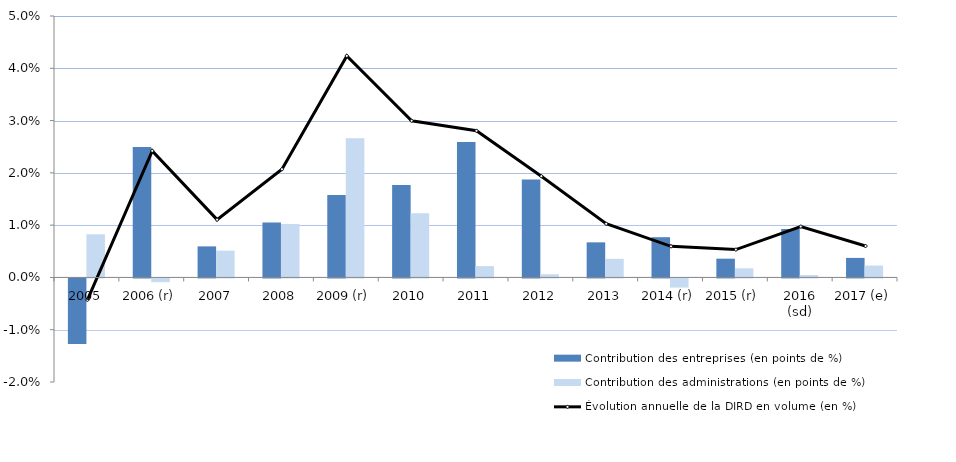
| Category | Contribution des entreprises (en points de %) | Contribution des administrations (en points de %) |
|---|---|---|
| 2005 | -0.013 | 0.008 |
| 2006 (r) | 0.025 | -0.001 |
| 2007 | 0.006 | 0.005 |
| 2008 | 0.011 | 0.01 |
| 2009 (r) | 0.016 | 0.027 |
| 2010 | 0.018 | 0.012 |
| 2011 | 0.026 | 0.002 |
| 2012 | 0.019 | 0.001 |
| 2013 | 0.007 | 0.004 |
| 2014 (r) | 0.008 | -0.002 |
| 2015 (r) | 0.004 | 0.002 |
| 2016 (sd) | 0.009 | 0 |
| 2017 (e) | 0.004 | 0.002 |